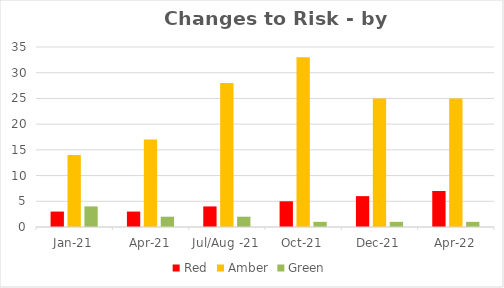
| Category | Red | Amber | Green |
|---|---|---|---|
| Jan-21 | 3 | 14 | 4 |
| Apr-21 | 3 | 17 | 2 |
| Jul/Aug -21 | 4 | 28 | 2 |
| Oct-21 | 5 | 33 | 1 |
| Dec-21 | 6 | 25 | 1 |
| Apr-22 | 7 | 25 | 1 |